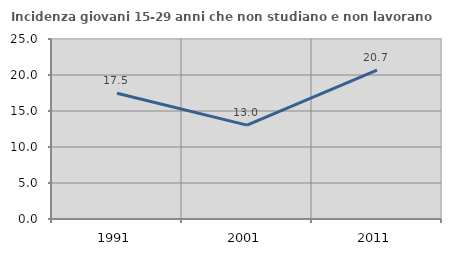
| Category | Incidenza giovani 15-29 anni che non studiano e non lavorano  |
|---|---|
| 1991.0 | 17.46 |
| 2001.0 | 13.043 |
| 2011.0 | 20.69 |